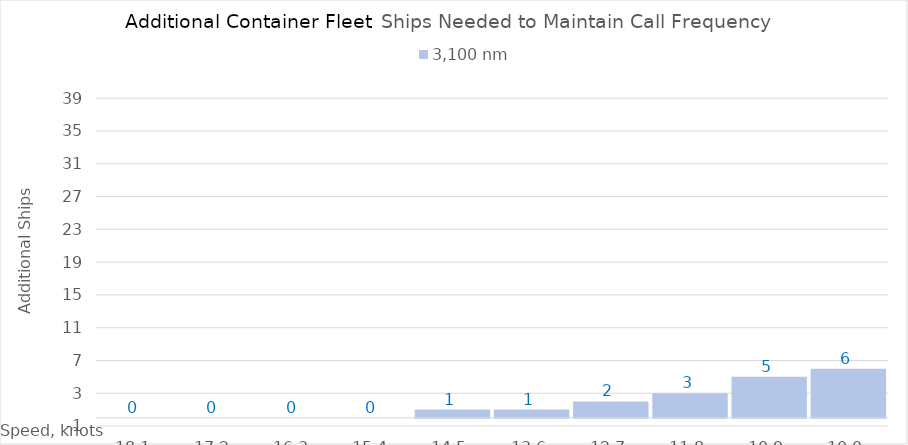
| Category | 3,100 |
|---|---|
| 18.1 | 0 |
| 17.200000000000003 | 0 |
| 16.300000000000004 | 0 |
| 15.400000000000004 | 0 |
| 14.500000000000004 | 1 |
| 13.600000000000003 | 1 |
| 12.700000000000003 | 2 |
| 11.800000000000002 | 3 |
| 10.900000000000002 | 5 |
| 10.000000000000002 | 6 |